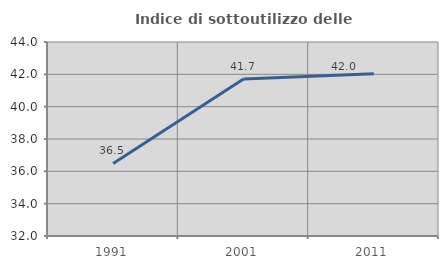
| Category | Indice di sottoutilizzo delle abitazioni  |
|---|---|
| 1991.0 | 36.491 |
| 2001.0 | 41.715 |
| 2011.0 | 42.036 |